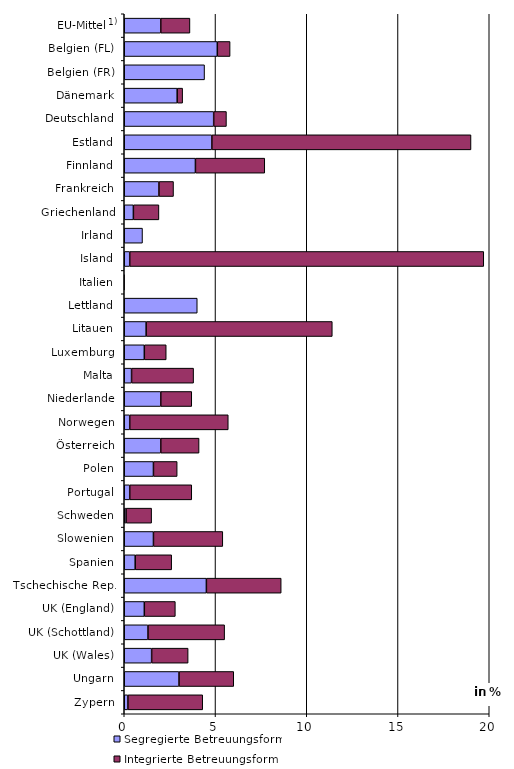
| Category | Segregierte Betreuungsform | Integrierte Betreuungsform |
|---|---|---|
| Zypern | 0.2 | 4.1 |
| Ungarn | 3 | 3 |
| UK (Wales) | 1.5 | 2 |
| UK (Schottland) | 1.3 | 4.2 |
| UK (England) | 1.1 | 1.7 |
| Tschechische Rep. | 4.5 | 4.1 |
| Spanien | 0.6 | 2 |
| Slowenien | 1.6 | 3.8 |
| Schweden | 0.1 | 1.4 |
| Portugal | 0.3 | 3.4 |
| Polen | 1.6 | 1.3 |
| Österreich | 2 | 2.1 |
| Norwegen | 0.3 | 5.4 |
| Niederlande | 2 | 1.7 |
| Malta | 0.4 | 3.4 |
| Luxemburg | 1.1 | 1.2 |
| Litauen | 1.2 | 10.2 |
| Lettland | 4 | 0 |
| Italien | 0 | 0.01 |
| Island | 0.3 | 19.4 |
| Irland | 1 | 0 |
| Griechenland | 0.5 | 1.4 |
| Frankreich | 1.9 | 0.8 |
| Finnland | 3.9 | 3.8 |
| Estland | 4.8 | 14.2 |
| Deutschland | 4.9 | 0.7 |
| Dänemark | 2.9 | 0.3 |
| Belgien (FR) | 4.4 | 0 |
| Belgien (FL) | 5.1 | 0.7 |
| EU-Mittel   | 2 | 1.6 |